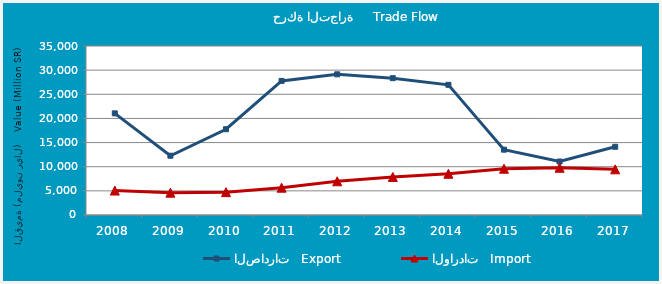
| Category | الصادرات   Export | الواردات   Import |
|---|---|---|
| 2008.0 | 21049443699 | 5063802020 |
| 2009.0 | 12274072348 | 4622750221 |
| 2010.0 | 17762754884 | 4735470844 |
| 2011.0 | 27769822511 | 5655150016 |
| 2012.0 | 29134339589 | 6984405555 |
| 2013.0 | 28333601845 | 7876773737 |
| 2014.0 | 26962388581 | 8536111182 |
| 2015.0 | 13529695768 | 9586654532 |
| 2016.0 | 11076802620 | 9787696024 |
| 2017.0 | 14131327808 | 9458026846 |